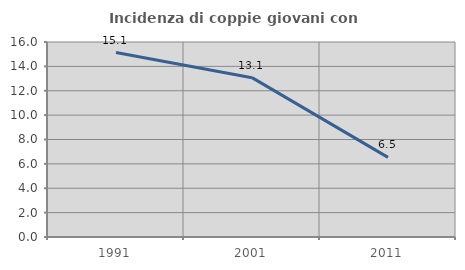
| Category | Incidenza di coppie giovani con figli |
|---|---|
| 1991.0 | 15.132 |
| 2001.0 | 13.074 |
| 2011.0 | 6.531 |